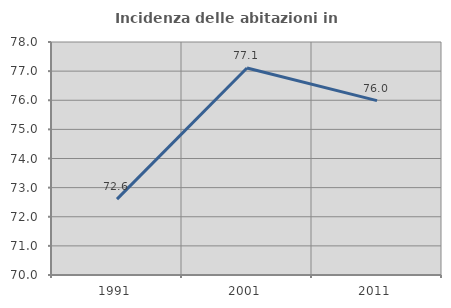
| Category | Incidenza delle abitazioni in proprietà  |
|---|---|
| 1991.0 | 72.604 |
| 2001.0 | 77.106 |
| 2011.0 | 75.987 |